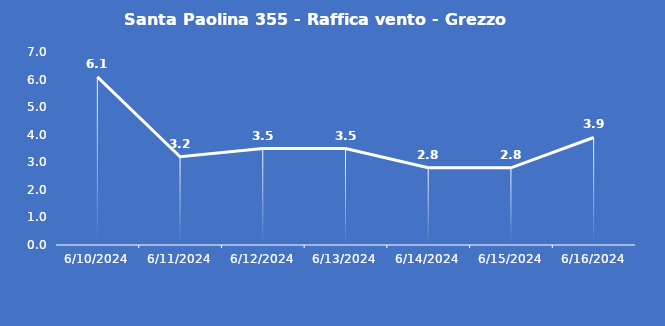
| Category | Santa Paolina 355 - Raffica vento - Grezzo (m/s) |
|---|---|
| 6/10/24 | 6.1 |
| 6/11/24 | 3.2 |
| 6/12/24 | 3.5 |
| 6/13/24 | 3.5 |
| 6/14/24 | 2.8 |
| 6/15/24 | 2.8 |
| 6/16/24 | 3.9 |